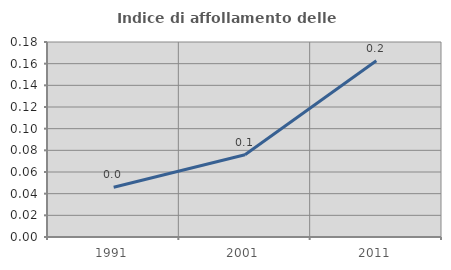
| Category | Indice di affollamento delle abitazioni  |
|---|---|
| 1991.0 | 0.046 |
| 2001.0 | 0.076 |
| 2011.0 | 0.163 |